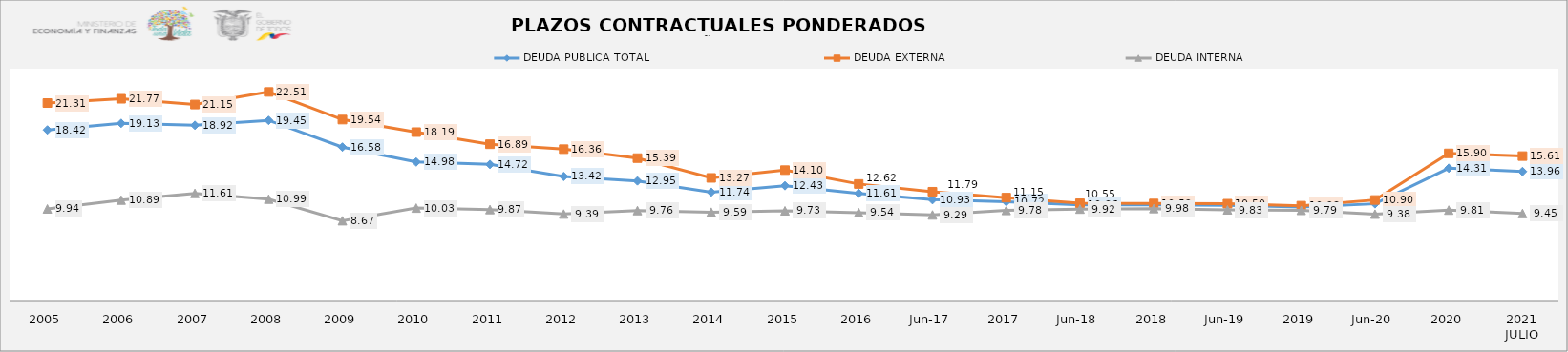
| Category | DEUDA PÚBLICA TOTAL | DEUDA EXTERNA  | DEUDA INTERNA |
|---|---|---|---|
| 2005 | 18.42 | 21.31 | 9.94 |
| 2006 | 19.13 | 21.77 | 10.89 |
| 2007 | 18.92 | 21.15 | 11.61 |
| 2008 | 19.45 | 22.505 | 10.99 |
| 2009 | 16.58 | 19.536 | 8.67 |
| 2010 | 14.98 | 18.188 | 10.03 |
| 2011 | 14.717 | 16.89 | 9.87 |
| 2012 | 13.423 | 16.356 | 9.39 |
| 2013 | 12.946 | 15.393 | 9.76 |
| 2014 | 11.737 | 13.27 | 9.59 |
| 2015 | 12.43 | 14.105 | 9.734 |
| 2016 | 11.611 | 12.616 | 9.541 |
| jun-17 | 10.928 | 11.786 | 9.294 |
| 2017 | 10.717 | 11.155 | 9.776 |
| jun-18 | 10.364 | 10.547 | 9.919 |
| 2018 | 10.371 | 10.522 | 9.976 |
| jun-19 | 10.321 | 10.498 | 9.835 |
| 2019 | 10.156 | 10.284 | 9.786 |
| jun-20 | 10.488 | 10.898 | 9.379 |
| 2020 | 14.309 | 15.905 | 9.812 |
| 2021 JULIO | 13.955 | 15.614 | 9.448 |